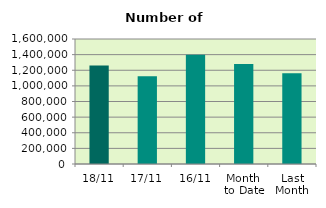
| Category | Series 0 |
|---|---|
| 18/11 | 1260766 |
| 17/11 | 1122084 |
| 16/11 | 1399760 |
| Month 
to Date | 1280940.571 |
| Last
Month | 1161301.714 |